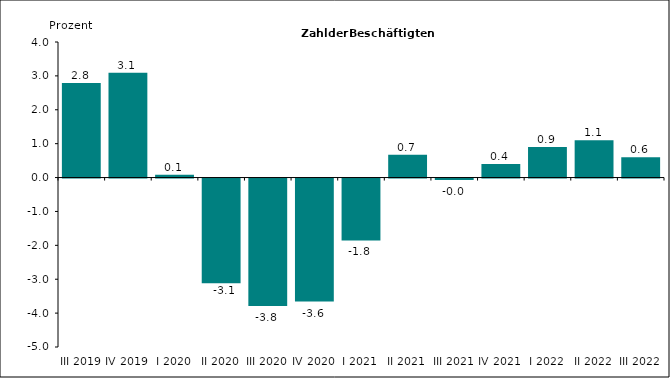
| Category | Series 0 |
|---|---|
| III 2019 | 2.793 |
| IV 2019 | 3.093 |
| I 2020 | 0.085 |
| II 2020 | -3.091 |
| III 2020 | -3.759 |
| IV 2020 | -3.628 |
| I 2021 | -1.825 |
| II 2021 | 0.67 |
| III 2021 | -0.044 |
| IV 2021 | 0.4 |
| I 2022 | 0.9 |
| II 2022 | 1.1 |
| III 2022 | 0.6 |